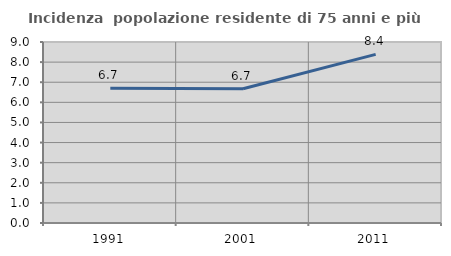
| Category | Incidenza  popolazione residente di 75 anni e più |
|---|---|
| 1991.0 | 6.695 |
| 2001.0 | 6.673 |
| 2011.0 | 8.387 |